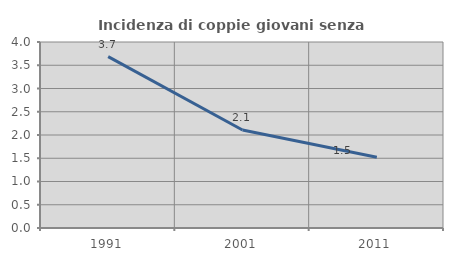
| Category | Incidenza di coppie giovani senza figli |
|---|---|
| 1991.0 | 3.685 |
| 2001.0 | 2.107 |
| 2011.0 | 1.521 |